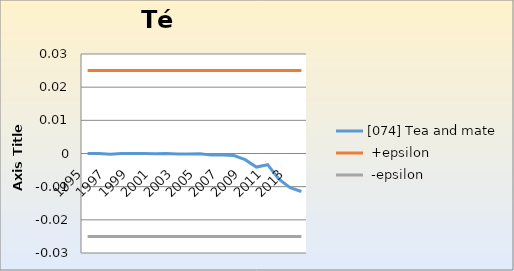
| Category | [074] Tea and mate |  +epsilon |  -epsilon |
|---|---|---|---|
| 1995.0 | 0 | 0.025 | -0.025 |
| 1996.0 | 0 | 0.025 | -0.025 |
| 1997.0 | 0 | 0.025 | -0.025 |
| 1998.0 | 0 | 0.025 | -0.025 |
| 1999.0 | 0 | 0.025 | -0.025 |
| 2000.0 | 0 | 0.025 | -0.025 |
| 2001.0 | 0 | 0.025 | -0.025 |
| 2002.0 | 0 | 0.025 | -0.025 |
| 2003.0 | 0 | 0.025 | -0.025 |
| 2004.0 | 0 | 0.025 | -0.025 |
| 2005.0 | 0 | 0.025 | -0.025 |
| 2006.0 | 0 | 0.025 | -0.025 |
| 2007.0 | 0 | 0.025 | -0.025 |
| 2008.0 | -0.001 | 0.025 | -0.025 |
| 2009.0 | -0.002 | 0.025 | -0.025 |
| 2010.0 | -0.004 | 0.025 | -0.025 |
| 2011.0 | -0.003 | 0.025 | -0.025 |
| 2012.0 | -0.008 | 0.025 | -0.025 |
| 2013.0 | -0.01 | 0.025 | -0.025 |
| 2014.0 | -0.011 | 0.025 | -0.025 |